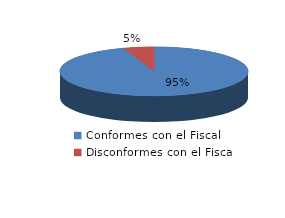
| Category | Series 0 |
|---|---|
| 0 | 127 |
| 1 | 7 |